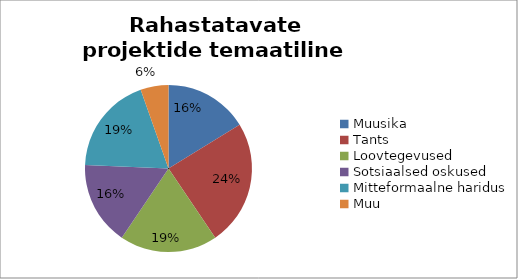
| Category | Series 0 |
|---|---|
| Muusika | 16.216 |
| Tants | 24.324 |
| Loovtegevused | 18.919 |
| Sotsiaalsed oskused | 16.216 |
| Mitteformaalne haridus | 18.919 |
| Muu | 5.405 |